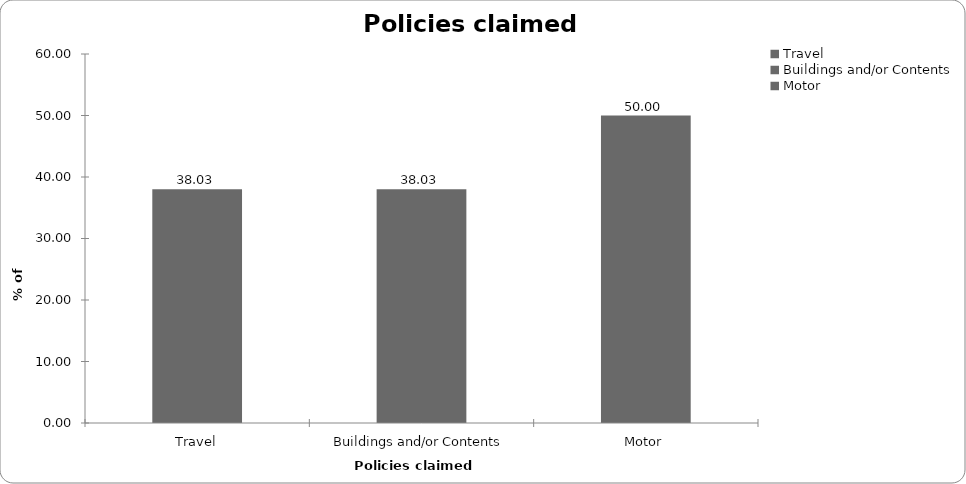
| Category | Policies claimed on |
|---|---|
| Travel | 38.028 |
| Buildings and/or Contents | 38.028 |
| Motor | 50 |